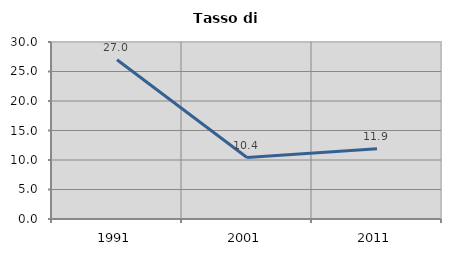
| Category | Tasso di disoccupazione   |
|---|---|
| 1991.0 | 26.984 |
| 2001.0 | 10.417 |
| 2011.0 | 11.905 |